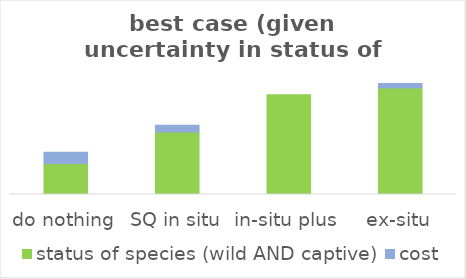
| Category | status of species (wild AND captive) | cost |
|---|---|---|
| do nothing | 0.254 | 0.091 |
| SQ in situ | 0.511 | 0.056 |
| in-situ plus | 0.818 | 0 |
| ex-situ | 0.872 | 0.038 |